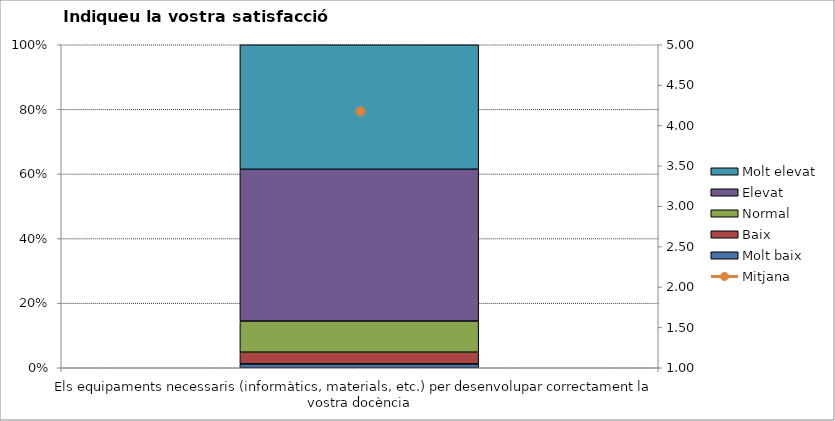
| Category | Molt baix | Baix | Normal  | Elevat | Molt elevat |
|---|---|---|---|---|---|
| Els equipaments necessaris (informàtics, materials, etc.) per desenvolupar correctament la vostra docència | 1 | 3 | 8 | 39 | 32 |